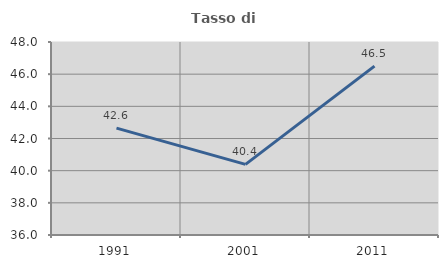
| Category | Tasso di occupazione   |
|---|---|
| 1991.0 | 42.648 |
| 2001.0 | 40.388 |
| 2011.0 | 46.497 |